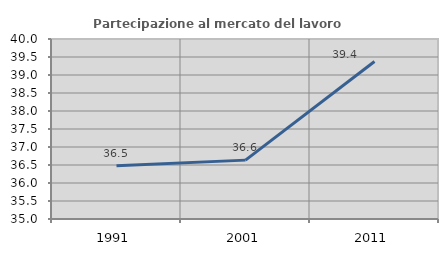
| Category | Partecipazione al mercato del lavoro  femminile |
|---|---|
| 1991.0 | 36.477 |
| 2001.0 | 36.635 |
| 2011.0 | 39.377 |